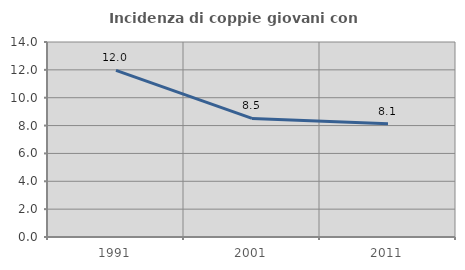
| Category | Incidenza di coppie giovani con figli |
|---|---|
| 1991.0 | 11.966 |
| 2001.0 | 8.511 |
| 2011.0 | 8.13 |